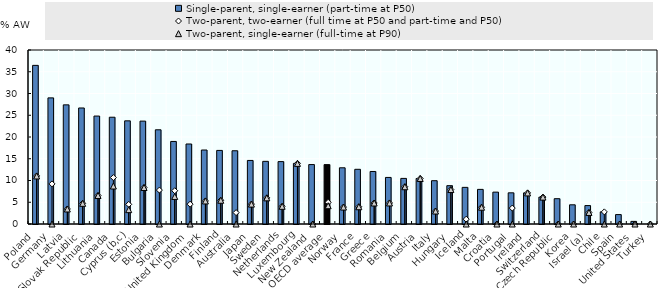
| Category | Single-parent, single-earner (part-time at P50)    |
|---|---|
| Poland | 36.466 |
| Germany | 28.994 |
| Latvia | 27.389 |
| Slovak Republic | 26.671 |
| Lithuania | 24.813 |
| Canada | 24.544 |
| Cyprus (b,c) | 23.715 |
| Estonia | 23.65 |
| Bulgaria | 21.658 |
| Slovenia | 18.979 |
| United Kingdom | 18.393 |
| Denmark | 17.009 |
| Finland | 16.918 |
| Australia | 16.838 |
| Japan | 14.61 |
| Sweden | 14.403 |
| Netherlands | 14.343 |
| Luxembourg | 13.931 |
| New Zealand | 13.663 |
| OECD average | 13.653 |
| Norway | 12.922 |
| France | 12.573 |
| Greece | 12.074 |
| Romania | 10.707 |
| Belgium | 10.485 |
| Austria | 10.463 |
| Italy | 9.954 |
| Hungary | 8.811 |
| Iceland | 8.423 |
| Malta | 7.956 |
| Croatia | 7.327 |
| Portugal | 7.167 |
| Ireland | 7.147 |
| Switzerland | 6.185 |
| Czech Republic | 5.817 |
| Korea | 4.412 |
| Israel (a) | 4.238 |
| Chile | 2.787 |
| Spain | 2.165 |
| United States | 0.602 |
| Turkey | 0 |